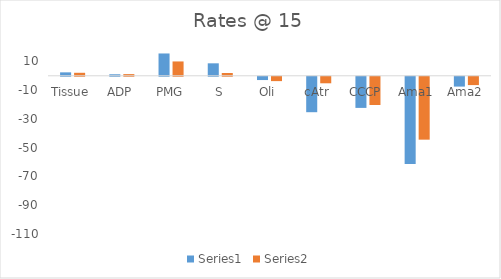
| Category | Series 0 | Series 1 |
|---|---|---|
| Tissue | 2.38 | 2.074 |
| ADP | 1.034 | 1.152 |
| PMG | 15.504 | 9.959 |
| S | 8.656 | 1.924 |
| Oli | -2.277 | -3.021 |
| cAtr | -24.634 | -4.531 |
| CCCP | -21.641 | -19.618 |
| Ama1 | -60.687 | -43.724 |
| Ama2 | -6.823 | -5.787 |